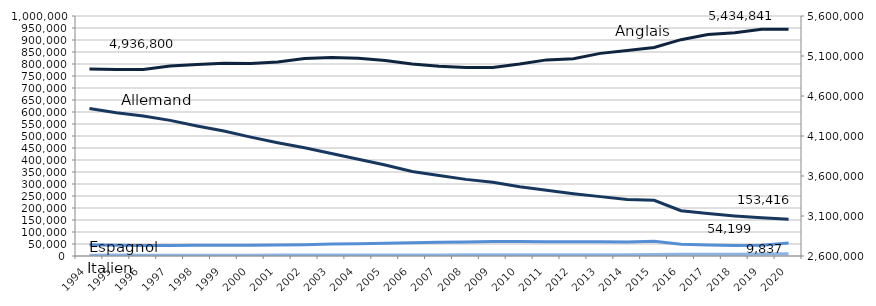
| Category | Allemand | Espagnol | Italien |
|---|---|---|---|
| 1994 | 614664 | 46932 | 3592 |
| 1995 | 597301 | 45130 | 3773 |
| 1996 | 583355 | 43347 | 3170 |
| 1997 | 565117 | 43822 | 2899 |
| 1998 | 541700 | 44297 | 3249 |
| 1999 | 520542 | 44505 | 3117 |
| 2000 | 495278 | 44519 | 3407 |
| 2001 | 472196 | 45380 | 3755 |
| 2002 | 450764 | 46758 | 3678 |
| 2003 | 427217 | 49748 | 3867 |
| 2004 | 403147 | 51245 | 3915 |
| 2005 | 379140 | 53227 | 3992 |
| 2006 | 351994 | 54918 | 4100 |
| 2007 | 335081 | 56891 | 4565 |
| 2008 | 319233 | 58139 | 5084 |
| 2009 | 307294 | 60446 | 5174 |
| 2010 | 288902 | 60160 | 5046 |
| 2011 | 273552 | 59609 | 5137 |
| 2012 | 259322 | 58937 | 5426 |
| 2013 | 247381 | 59599 | 4809 |
| 2014 | 235812 | 58291 | 5058 |
| 2015 | 232126 | 61403 | 5849 |
| 2016 | 188656 | 48484 | 6949 |
| 2017 | 177285 | 45436 | 7282 |
| 2018 | 166874 | 43764 | 7010 |
| 2019 | 158915 | 44478 | 8221 |
| 2020 | 153416 | 54199 | 9837 |